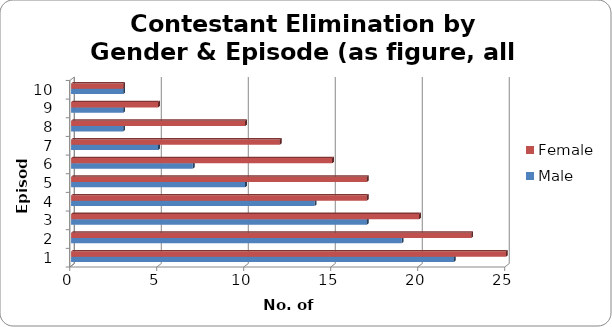
| Category | Male | Female |
|---|---|---|
| 0 | 22 | 25 |
| 1 | 19 | 23 |
| 2 | 17 | 20 |
| 3 | 14 | 17 |
| 4 | 10 | 17 |
| 5 | 7 | 15 |
| 6 | 5 | 12 |
| 7 | 3 | 10 |
| 8 | 3 | 5 |
| 9 | 3 | 3 |